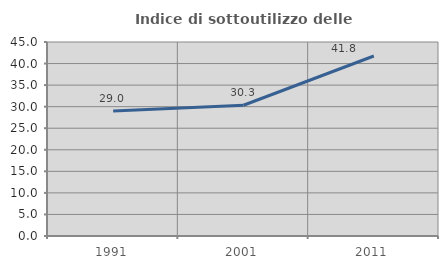
| Category | Indice di sottoutilizzo delle abitazioni  |
|---|---|
| 1991.0 | 28.972 |
| 2001.0 | 30.326 |
| 2011.0 | 41.756 |